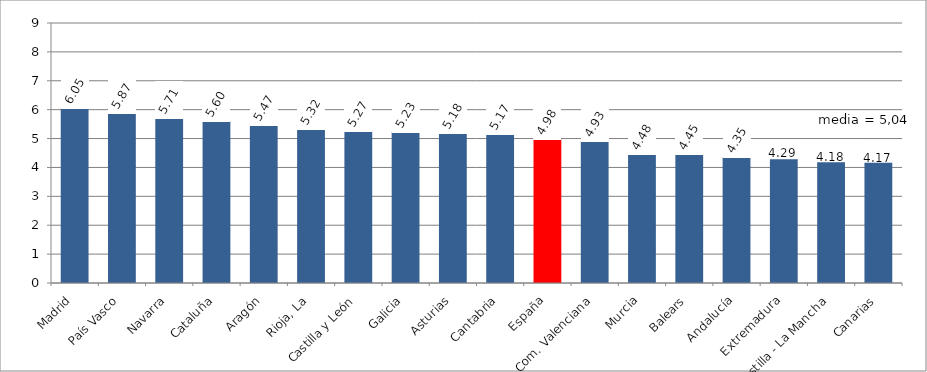
| Category | ÍNDICE18 |
|---|---|
| Madrid | 6.053 |
| País Vasco | 5.87 |
| Navarra | 5.71 |
| Cataluña | 5.595 |
| Aragón | 5.469 |
| Rioja, La | 5.322 |
| Castilla y León | 5.274 |
| Galicia | 5.231 |
| Asturias | 5.178 |
| Cantabria | 5.168 |
| España | 4.977 |
| Com. Valenciana | 4.928 |
| Murcia | 4.476 |
| Balears | 4.455 |
| Andalucía | 4.354 |
| Extremadura | 4.287 |
| Castilla - La Mancha | 4.176 |
| Canarias | 4.167 |